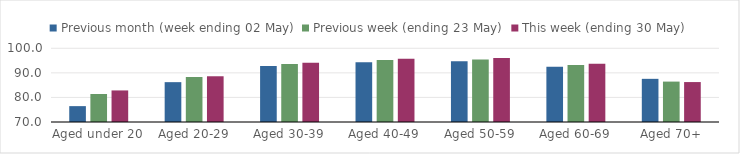
| Category | Previous month (week ending 02 May) | Previous week (ending 23 May) | This week (ending 30 May) |
|---|---|---|---|
| Aged under 20 | 76.458 | 81.399 | 82.848 |
| Aged 20-29 | 86.216 | 88.315 | 88.615 |
| Aged 30-39 | 92.754 | 93.616 | 94.141 |
| Aged 40-49 | 94.356 | 95.208 | 95.784 |
| Aged 50-59 | 94.736 | 95.439 | 96.018 |
| Aged 60-69 | 92.456 | 93.222 | 93.736 |
| Aged 70+ | 87.566 | 86.444 | 86.253 |